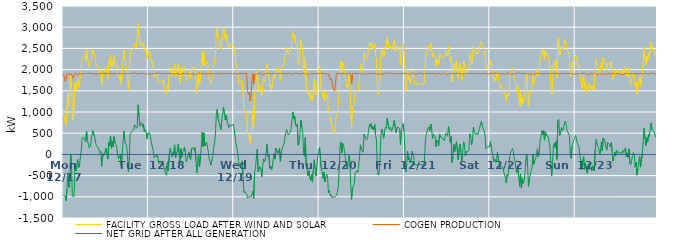
| Category | FACILITY GROSS LOAD AFTER WIND AND SOLAR | COGEN PRODUCTION | NET GRID AFTER ALL GENERATION |
|---|---|---|---|
|  Mon  12/17 | 934 | 1902 | -968 |
|  Mon  12/17 | 872 | 1835 | -963 |
|  Mon  12/17 | 745 | 1725 | -980 |
|  Mon  12/17 | 679 | 1770 | -1091 |
|  Mon  12/17 | 1091 | 1899 | -808 |
|  Mon  12/17 | 1448 | 1897 | -449 |
|  Mon  12/17 | 1136 | 1901 | -765 |
|  Mon  12/17 | 1113 | 1905 | -792 |
|  Mon  12/17 | 1889 | 1880 | 9 |
|  Mon  12/17 | 1763 | 1907 | -144 |
|  Mon  12/17 | 912 | 1899 | -987 |
|  Mon  12/17 | 807 | 1794 | -987 |
|  Mon  12/17 | 824 | 1813 | -989 |
|  Mon  12/17 | 1705 | 1916 | -211 |
|  Mon  12/17 | 1522 | 1912 | -390 |
|  Mon  12/17 | 1631 | 1900 | -269 |
|  Mon  12/17 | 1791 | 1911 | -120 |
|  Mon  12/17 | 1569 | 1884 | -315 |
|  Mon  12/17 | 1635 | 1921 | -286 |
|  Mon  12/17 | 1834 | 1894 | -60 |
|  Mon  12/17 | 1995 | 1912 | 83 |
|  Mon  12/17 | 2271 | 1893 | 378 |
|  Mon  12/17 | 2294 | 1908 | 386 |
|  Mon  12/17 | 2303 | 1904 | 399 |
|  Mon  12/17 | 2331 | 1909 | 422 |
|  Mon  12/17 | 2203 | 1908 | 295 |
|  Mon  12/17 | 2473 | 1922 | 551 |
|  Mon  12/17 | 2235 | 1902 | 333 |
|  Mon  12/17 | 2253 | 1907 | 346 |
|  Mon  12/17 | 2071 | 1919 | 152 |
|  Mon  12/17 | 2098 | 1916 | 182 |
|  Mon  12/17 | 2201 | 1906 | 295 |
|  Mon  12/17 | 2340 | 1904 | 436 |
|  Mon  12/17 | 2460 | 1899 | 561 |
|  Mon  12/17 | 2443 | 1898 | 545 |
|  Mon  12/17 | 2332 | 1902 | 430 |
|  Mon  12/17 | 2190 | 1900 | 290 |
|  Mon  12/17 | 2095 | 1885 | 210 |
|  Mon  12/17 | 2125 | 1907 | 218 |
|  Mon  12/17 | 2075 | 1914 | 161 |
|  Mon  12/17 | 2071 | 1911 | 160 |
|  Mon  12/17 | 1924 | 1887 | 37 |
|  Mon  12/17 | 1990 | 1920 | 70 |
|  Mon  12/17 | 1621 | 1902 | -281 |
|  Mon  12/17 | 1925 | 1892 | 33 |
|  Mon  12/17 | 1879 | 1920 | -41 |
|  Mon  12/17 | 1919 | 1913 | 6 |
|  Mon  12/17 | 1910 | 1905 | 5 |
|  Mon  12/17 | 2046 | 1898 | 148 |
|  Mon  12/17 | 1924 | 1922 | 2 |
|  Mon  12/17 | 1782 | 1893 | -111 |
|  Mon  12/17 | 2191 | 1915 | 276 |
|  Mon  12/17 | 2108 | 1912 | 196 |
|  Mon  12/17 | 2347 | 1915 | 432 |
|  Mon  12/17 | 2057 | 1912 | 145 |
|  Mon  12/17 | 2197 | 1886 | 311 |
|  Mon  12/17 | 2072 | 1892 | 180 |
|  Mon  12/17 | 2339 | 1922 | 417 |
|  Mon  12/17 | 2163 | 1888 | 275 |
|  Mon  12/17 | 2144 | 1904 | 240 |
|  Mon  12/17 | 2052 | 1905 | 147 |
|  Mon  12/17 | 1871 | 1885 | -14 |
|  Mon  12/17 | 1812 | 1914 | -102 |
|  Mon  12/17 | 1787 | 1904 | -117 |
|  Mon  12/17 | 1912 | 1902 | 10 |
|  Mon  12/17 | 1630 | 1910 | -280 |
|  Mon  12/17 | 1874 | 1891 | -17 |
|  Mon  12/17 | 2189 | 1911 | 278 |
|  Mon  12/17 | 2464 | 1916 | 548 |
|  Mon  12/17 | 2244 | 1895 | 349 |
|  Mon  12/17 | 2141 | 1897 | 244 |
|  Mon  12/17 | 2124 | 1906 | 218 |
|  Mon  12/17 | 1903 | 1908 | -5 |
|  Mon  12/17 | 1511 | 1914 | -403 |
|  Mon  12/17 | 1759 | 1904 | -145 |
|  Mon  12/17 | 2392 | 1904 | 488 |
|  Mon  12/17 | 2382 | 1911 | 471 |
|  Mon  12/17 | 2452 | 1908 | 544 |
|  Mon  12/17 | 2438 | 1917 | 521 |
|  Mon  12/17 | 2476 | 1897 | 579 |
|  Mon  12/17 | 2614 | 1915 | 699 |
|  Mon  12/17 | 2568 | 1894 | 674 |
|  Mon  12/17 | 2526 | 1911 | 615 |
|  Mon  12/17 | 2535 | 1883 | 652 |
|  Mon  12/17 | 3089 | 1921 | 1168 |
|  Mon  12/17 | 2785 | 1892 | 893 |
|  Mon  12/17 | 2555 | 1892 | 663 |
|  Mon  12/17 | 2587 | 1913 | 674 |
|  Mon  12/17 | 2657 | 1905 | 752 |
|  Mon  12/17 | 2564 | 1911 | 653 |
|  Mon  12/17 | 2626 | 1915 | 711 |
|  Mon  12/17 | 2428 | 1898 | 530 |
|  Mon  12/17 | 2486 | 1901 | 585 |
|  Mon  12/17 | 2444 | 1898 | 546 |
|  Mon  12/17 | 2251 | 1885 | 366 |
|  Mon  12/17 | 2397 | 1899 | 498 |
|  Tue  12/18 | 2416 | 1907 | 509 |
|  Tue  12/18 | 2411 | 1897 | 514 |
|  Tue  12/18 | 2299 | 1904 | 395 |
|  Tue  12/18 | 2166 | 1898 | 268 |
|  Tue  12/18 | 2200 | 1920 | 280 |
|  Tue  12/18 | 1981 | 1904 | 77 |
|  Tue  12/18 | 1826 | 1910 | -84 |
|  Tue  12/18 | 1803 | 1909 | -106 |
|  Tue  12/18 | 1900 | 1911 | -11 |
|  Tue  12/18 | 1852 | 1912 | -60 |
|  Tue  12/18 | 1874 | 1896 | -22 |
|  Tue  12/18 | 1713 | 1919 | -206 |
|  Tue  12/18 | 1720 | 1907 | -187 |
|  Tue  12/18 | 1700 | 1908 | -208 |
|  Tue  12/18 | 1689 | 1888 | -199 |
|  Tue  12/18 | 1698 | 1902 | -204 |
|  Tue  12/18 | 1760 | 1913 | -153 |
|  Tue  12/18 | 1614 | 1916 | -302 |
|  Tue  12/18 | 1517 | 1892 | -375 |
|  Tue  12/18 | 1440 | 1901 | -461 |
|  Tue  12/18 | 1416 | 1908 | -492 |
|  Tue  12/18 | 1634 | 1911 | -277 |
|  Tue  12/18 | 1527 | 1905 | -378 |
|  Tue  12/18 | 1899 | 1904 | -5 |
|  Tue  12/18 | 2052 | 1907 | 145 |
|  Tue  12/18 | 1948 | 1902 | 46 |
|  Tue  12/18 | 1843 | 1900 | -57 |
|  Tue  12/18 | 1948 | 1906 | 42 |
|  Tue  12/18 | 1880 | 1897 | -17 |
|  Tue  12/18 | 2126 | 1900 | 226 |
|  Tue  12/18 | 1810 | 1895 | -85 |
|  Tue  12/18 | 1899 | 1881 | 18 |
|  Tue  12/18 | 1987 | 1917 | 70 |
|  Tue  12/18 | 2138 | 1897 | 241 |
|  Tue  12/18 | 1929 | 1895 | 34 |
|  Tue  12/18 | 1688 | 1891 | -203 |
|  Tue  12/18 | 2027 | 1889 | 138 |
|  Tue  12/18 | 1833 | 1903 | -70 |
|  Tue  12/18 | 1967 | 1906 | 61 |
|  Tue  12/18 | 2007 | 1913 | 94 |
|  Tue  12/18 | 2074 | 1910 | 164 |
|  Tue  12/18 | 1967 | 1910 | 57 |
|  Tue  12/18 | 1726 | 1902 | -176 |
|  Tue  12/18 | 1763 | 1897 | -134 |
|  Tue  12/18 | 1749 | 1902 | -153 |
|  Tue  12/18 | 1947 | 1896 | 51 |
|  Tue  12/18 | 1845 | 1904 | -59 |
|  Tue  12/18 | 1786 | 1903 | -117 |
|  Tue  12/18 | 2018 | 1892 | 126 |
|  Tue  12/18 | 2064 | 1899 | 165 |
|  Tue  12/18 | 2056 | 1907 | 149 |
|  Tue  12/18 | 1985 | 1890 | 95 |
|  Tue  12/18 | 2054 | 1890 | 164 |
|  Tue  12/18 | 1775 | 1908 | -133 |
|  Tue  12/18 | 1457 | 1888 | -431 |
|  Tue  12/18 | 1719 | 1890 | -171 |
|  Tue  12/18 | 1926 | 1917 | 9 |
|  Tue  12/18 | 1605 | 1904 | -299 |
|  Tue  12/18 | 1813 | 1910 | -97 |
|  Tue  12/18 | 2091 | 1924 | 167 |
|  Tue  12/18 | 2431 | 1909 | 522 |
|  Tue  12/18 | 2098 | 1915 | 183 |
|  Tue  12/18 | 2397 | 1890 | 507 |
|  Tue  12/18 | 2092 | 1894 | 198 |
|  Tue  12/18 | 2155 | 1906 | 249 |
|  Tue  12/18 | 2178 | 1882 | 296 |
|  Tue  12/18 | 2194 | 1912 | 282 |
|  Tue  12/18 | 1935 | 1889 | 46 |
|  Tue  12/18 | 1781 | 1895 | -114 |
|  Tue  12/18 | 1713 | 1902 | -189 |
|  Tue  12/18 | 1659 | 1908 | -249 |
|  Tue  12/18 | 1781 | 1897 | -116 |
|  Tue  12/18 | 1859 | 1891 | -32 |
|  Tue  12/18 | 2079 | 1915 | 164 |
|  Tue  12/18 | 2183 | 1910 | 273 |
|  Tue  12/18 | 2401 | 1895 | 506 |
|  Tue  12/18 | 2898 | 1905 | 993 |
|  Tue  12/18 | 2980 | 1917 | 1063 |
|  Tue  12/18 | 2745 | 1905 | 840 |
|  Tue  12/18 | 2715 | 1893 | 822 |
|  Tue  12/18 | 2552 | 1897 | 655 |
|  Tue  12/18 | 2484 | 1902 | 582 |
|  Tue  12/18 | 2720 | 1917 | 803 |
|  Tue  12/18 | 2693 | 1903 | 790 |
|  Tue  12/18 | 3022 | 1913 | 1109 |
|  Tue  12/18 | 2858 | 1904 | 954 |
|  Tue  12/18 | 2717 | 1902 | 815 |
|  Tue  12/18 | 2847 | 1916 | 931 |
|  Tue  12/18 | 2691 | 1892 | 799 |
|  Tue  12/18 | 2599 | 1892 | 707 |
|  Tue  12/18 | 2541 | 1910 | 631 |
|  Tue  12/18 | 2617 | 1916 | 701 |
|  Tue  12/18 | 2578 | 1911 | 667 |
|  Tue  12/18 | 2566 | 1913 | 653 |
|  Tue  12/18 | 2580 | 1890 | 690 |
|  Tue  12/18 | 2627 | 1909 | 718 |
|  Wed  12/19 | 2497 | 1919 | 578 |
|  Wed  12/19 | 2344 | 1915 | 429 |
|  Wed  12/19 | 2164 | 1890 | 274 |
|  Wed  12/19 | 2142 | 1891 | 251 |
|  Wed  12/19 | 1955 | 1903 | 52 |
|  Wed  12/19 | 1728 | 1899 | -171 |
|  Wed  12/19 | 1635 | 1904 | -269 |
|  Wed  12/19 | 1616 | 1908 | -292 |
|  Wed  12/19 | 1695 | 1918 | -223 |
|  Wed  12/19 | 1751 | 1912 | -161 |
|  Wed  12/19 | 1415 | 1908 | -493 |
|  Wed  12/19 | 1002 | 1907 | -905 |
|  Wed  12/19 | 1024 | 1900 | -876 |
|  Wed  12/19 | 1017 | 1895 | -878 |
|  Wed  12/19 | 993 | 1921 | -928 |
|  Wed  12/19 | 475 | 1505 | -1030 |
|  Wed  12/19 | 413 | 1420 | -1007 |
|  Wed  12/19 | 475 | 1471 | -996 |
|  Wed  12/19 | 256 | 1267 | -1011 |
|  Wed  12/19 | 406 | 1408 | -1002 |
|  Wed  12/19 | 728 | 1723 | -995 |
|  Wed  12/19 | 1036 | 1908 | -872 |
|  Wed  12/19 | 622 | 1658 | -1036 |
|  Wed  12/19 | 1443 | 1879 | -436 |
|  Wed  12/19 | 1612 | 1896 | -284 |
|  Wed  12/19 | 1606 | 1900 | -294 |
|  Wed  12/19 | 2030 | 1906 | 124 |
|  Wed  12/19 | 1499 | 1905 | -406 |
|  Wed  12/19 | 1484 | 1905 | -421 |
|  Wed  12/19 | 1637 | 1927 | -290 |
|  Wed  12/19 | 1569 | 1902 | -333 |
|  Wed  12/19 | 1381 | 1909 | -528 |
|  Wed  12/19 | 1598 | 1884 | -286 |
|  Wed  12/19 | 1803 | 1906 | -103 |
|  Wed  12/19 | 1724 | 1892 | -168 |
|  Wed  12/19 | 1763 | 1899 | -136 |
|  Wed  12/19 | 1762 | 1907 | -145 |
|  Wed  12/19 | 2153 | 1914 | 239 |
|  Wed  12/19 | 1873 | 1918 | -45 |
|  Wed  12/19 | 1911 | 1904 | 7 |
|  Wed  12/19 | 1582 | 1910 | -328 |
|  Wed  12/19 | 1641 | 1918 | -277 |
|  Wed  12/19 | 1531 | 1897 | -366 |
|  Wed  12/19 | 1642 | 1906 | -264 |
|  Wed  12/19 | 1826 | 1915 | -89 |
|  Wed  12/19 | 1918 | 1900 | 18 |
|  Wed  12/19 | 1790 | 1901 | -111 |
|  Wed  12/19 | 2044 | 1895 | 149 |
|  Wed  12/19 | 1999 | 1906 | 93 |
|  Wed  12/19 | 1931 | 1910 | 21 |
|  Wed  12/19 | 1996 | 1914 | 82 |
|  Wed  12/19 | 2048 | 1906 | 142 |
|  Wed  12/19 | 1729 | 1904 | -175 |
|  Wed  12/19 | 1959 | 1912 | 47 |
|  Wed  12/19 | 2059 | 1915 | 144 |
|  Wed  12/19 | 2039 | 1905 | 134 |
|  Wed  12/19 | 2155 | 1909 | 246 |
|  Wed  12/19 | 2276 | 1900 | 376 |
|  Wed  12/19 | 2412 | 1899 | 513 |
|  Wed  12/19 | 2498 | 1912 | 586 |
|  Wed  12/19 | 2412 | 1899 | 513 |
|  Wed  12/19 | 2353 | 1897 | 456 |
|  Wed  12/19 | 2408 | 1919 | 489 |
|  Wed  12/19 | 2423 | 1897 | 526 |
|  Wed  12/19 | 2491 | 1891 | 600 |
|  Wed  12/19 | 2696 | 1911 | 785 |
|  Wed  12/19 | 2904 | 1902 | 1002 |
|  Wed  12/19 | 2757 | 1919 | 838 |
|  Wed  12/19 | 2816 | 1913 | 903 |
|  Wed  12/19 | 2595 | 1893 | 702 |
|  Wed  12/19 | 2576 | 1916 | 660 |
|  Wed  12/19 | 2621 | 1905 | 716 |
|  Wed  12/19 | 2122 | 1906 | 216 |
|  Wed  12/19 | 2157 | 1910 | 247 |
|  Wed  12/19 | 2388 | 1894 | 494 |
|  Wed  12/19 | 2718 | 1908 | 810 |
|  Wed  12/19 | 2546 | 1902 | 644 |
|  Wed  12/19 | 2467 | 1912 | 555 |
|  Wed  12/19 | 1952 | 1915 | 37 |
|  Wed  12/19 | 1872 | 1918 | -46 |
|  Wed  12/19 | 2299 | 1903 | 396 |
|  Wed  12/19 | 1659 | 1902 | -243 |
|  Wed  12/19 | 1531 | 1900 | -369 |
|  Wed  12/19 | 1407 | 1910 | -503 |
|  Wed  12/19 | 1504 | 1884 | -380 |
|  Wed  12/19 | 1349 | 1894 | -545 |
|  Wed  12/19 | 1292 | 1903 | -611 |
|  Wed  12/19 | 1438 | 1912 | -474 |
|  Wed  12/19 | 1247 | 1900 | -653 |
|  Wed  12/19 | 1539 | 1915 | -376 |
|  Wed  12/19 | 1774 | 1903 | -129 |
|  Wed  12/19 | 1552 | 1897 | -345 |
|  Wed  12/19 | 1401 | 1908 | -507 |
|  Wed  12/19 | 1578 | 1896 | -318 |
|  Wed  12/19 | 1877 | 1906 | -29 |
|  Wed  12/19 | 1996 | 1919 | 77 |
|  Thu  12/20 | 2086 | 1916 | 170 |
|  Thu  12/20 | 2083 | 1912 | 171 |
|  Thu  12/20 | 1555 | 1906 | -351 |
|  Thu  12/20 | 1491 | 1895 | -404 |
|  Thu  12/20 | 1352 | 1920 | -568 |
|  Thu  12/20 | 1496 | 1912 | -416 |
|  Thu  12/20 | 1258 | 1907 | -649 |
|  Thu  12/20 | 1384 | 1912 | -528 |
|  Thu  12/20 | 1426 | 1892 | -466 |
|  Thu  12/20 | 1396 | 1898 | -502 |
|  Thu  12/20 | 1001 | 1899 | -898 |
|  Thu  12/20 | 1039 | 1884 | -845 |
|  Thu  12/20 | 773 | 1754 | -981 |
|  Thu  12/20 | 839 | 1790 | -951 |
|  Thu  12/20 | 695 | 1723 | -1028 |
|  Thu  12/20 | 563 | 1562 | -999 |
|  Thu  12/20 | 554 | 1547 | -993 |
|  Thu  12/20 | 487 | 1495 | -1008 |
|  Thu  12/20 | 689 | 1677 | -988 |
|  Thu  12/20 | 945 | 1912 | -967 |
|  Thu  12/20 | 1004 | 1893 | -889 |
|  Thu  12/20 | 1143 | 1921 | -778 |
|  Thu  12/20 | 1488 | 1895 | -407 |
|  Thu  12/20 | 2084 | 1907 | 177 |
|  Thu  12/20 | 2197 | 1901 | 296 |
|  Thu  12/20 | 1943 | 1909 | 34 |
|  Thu  12/20 | 2168 | 1904 | 264 |
|  Thu  12/20 | 2118 | 1898 | 220 |
|  Thu  12/20 | 1984 | 1899 | 85 |
|  Thu  12/20 | 1823 | 1883 | -60 |
|  Thu  12/20 | 1676 | 1899 | -223 |
|  Thu  12/20 | 1571 | 1910 | -339 |
|  Thu  12/20 | 1649 | 1904 | -255 |
|  Thu  12/20 | 1883 | 1906 | -23 |
|  Thu  12/20 | 1821 | 1920 | -99 |
|  Thu  12/20 | 1215 | 1896 | -681 |
|  Thu  12/20 | 604 | 1667 | -1063 |
|  Thu  12/20 | 1104 | 1900 | -796 |
|  Thu  12/20 | 1102 | 1899 | -797 |
|  Thu  12/20 | 1203 | 1903 | -700 |
|  Thu  12/20 | 1450 | 1894 | -444 |
|  Thu  12/20 | 1442 | 1905 | -463 |
|  Thu  12/20 | 1514 | 1902 | -388 |
|  Thu  12/20 | 1488 | 1914 | -426 |
|  Thu  12/20 | 1630 | 1900 | -270 |
|  Thu  12/20 | 1845 | 1903 | -58 |
|  Thu  12/20 | 2133 | 1908 | 225 |
|  Thu  12/20 | 2016 | 1897 | 119 |
|  Thu  12/20 | 2042 | 1904 | 138 |
|  Thu  12/20 | 1958 | 1906 | 52 |
|  Thu  12/20 | 2381 | 1899 | 482 |
|  Thu  12/20 | 2404 | 1906 | 498 |
|  Thu  12/20 | 2289 | 1923 | 366 |
|  Thu  12/20 | 2221 | 1882 | 339 |
|  Thu  12/20 | 2292 | 1896 | 396 |
|  Thu  12/20 | 2451 | 1916 | 535 |
|  Thu  12/20 | 2626 | 1924 | 702 |
|  Thu  12/20 | 2568 | 1911 | 657 |
|  Thu  12/20 | 2645 | 1915 | 730 |
|  Thu  12/20 | 2505 | 1908 | 597 |
|  Thu  12/20 | 2570 | 1917 | 653 |
|  Thu  12/20 | 2484 | 1904 | 580 |
|  Thu  12/20 | 2623 | 1913 | 710 |
|  Thu  12/20 | 2360 | 1908 | 452 |
|  Thu  12/20 | 2246 | 1906 | 340 |
|  Thu  12/20 | 1592 | 1895 | -303 |
|  Thu  12/20 | 1411 | 1896 | -485 |
|  Thu  12/20 | 1471 | 1903 | -432 |
|  Thu  12/20 | 1772 | 1897 | -125 |
|  Thu  12/20 | 2334 | 1889 | 445 |
|  Thu  12/20 | 2485 | 1892 | 593 |
|  Thu  12/20 | 2417 | 1898 | 519 |
|  Thu  12/20 | 2285 | 1907 | 378 |
|  Thu  12/20 | 2416 | 1892 | 524 |
|  Thu  12/20 | 2557 | 1919 | 638 |
|  Thu  12/20 | 2520 | 1909 | 611 |
|  Thu  12/20 | 2773 | 1916 | 857 |
|  Thu  12/20 | 2766 | 1915 | 851 |
|  Thu  12/20 | 2531 | 1910 | 621 |
|  Thu  12/20 | 2490 | 1910 | 580 |
|  Thu  12/20 | 2557 | 1920 | 637 |
|  Thu  12/20 | 2446 | 1900 | 546 |
|  Thu  12/20 | 2504 | 1905 | 599 |
|  Thu  12/20 | 2507 | 1897 | 610 |
|  Thu  12/20 | 2693 | 1892 | 801 |
|  Thu  12/20 | 2687 | 1903 | 784 |
|  Thu  12/20 | 2427 | 1909 | 518 |
|  Thu  12/20 | 2516 | 1918 | 598 |
|  Thu  12/20 | 2553 | 1907 | 646 |
|  Thu  12/20 | 2537 | 1890 | 647 |
|  Thu  12/20 | 2503 | 1891 | 612 |
|  Thu  12/20 | 2120 | 1890 | 230 |
|  Thu  12/20 | 2491 | 1913 | 578 |
|  Thu  12/20 | 2509 | 1914 | 595 |
|  Thu  12/20 | 2632 | 1907 | 725 |
|  Thu  12/20 | 2441 | 1897 | 544 |
|  Fri  12/21 | 2455 | 1913 | 542 |
|  Fri  12/21 | 1485 | 1903 | -418 |
|  Fri  12/21 | 1671 | 1904 | -233 |
|  Fri  12/21 | 2002 | 1919 | 83 |
|  Fri  12/21 | 1766 | 1896 | -130 |
|  Fri  12/21 | 1831 | 1902 | -71 |
|  Fri  12/21 | 1686 | 1883 | -197 |
|  Fri  12/21 | 1761 | 1910 | -149 |
|  Fri  12/21 | 1979 | 1904 | 75 |
|  Fri  12/21 | 1939 | 1916 | 23 |
|  Fri  12/21 | 1854 | 1916 | -62 |
|  Fri  12/21 | 1650 | 1894 | -244 |
|  Fri  12/21 | 1678 | 1907 | -229 |
|  Fri  12/21 | 1652 | 1892 | -240 |
|  Fri  12/21 | 1627 | 1900 | -273 |
|  Fri  12/21 | 1697 | 1914 | -217 |
|  Fri  12/21 | 1692 | 1903 | -211 |
|  Fri  12/21 | 1661 | 1908 | -247 |
|  Fri  12/21 | 1681 | 1898 | -217 |
|  Fri  12/21 | 1683 | 1917 | -234 |
|  Fri  12/21 | 1613 | 1890 | -277 |
|  Fri  12/21 | 1650 | 1908 | -258 |
|  Fri  12/21 | 1730 | 1906 | -176 |
|  Fri  12/21 | 2218 | 1902 | 316 |
|  Fri  12/21 | 2369 | 1908 | 461 |
|  Fri  12/21 | 2386 | 1911 | 475 |
|  Fri  12/21 | 2518 | 1901 | 617 |
|  Fri  12/21 | 2555 | 1906 | 649 |
|  Fri  12/21 | 2457 | 1910 | 547 |
|  Fri  12/21 | 2625 | 1910 | 715 |
|  Fri  12/21 | 2535 | 1918 | 617 |
|  Fri  12/21 | 2287 | 1913 | 374 |
|  Fri  12/21 | 2381 | 1906 | 475 |
|  Fri  12/21 | 2378 | 1888 | 490 |
|  Fri  12/21 | 2317 | 1895 | 422 |
|  Fri  12/21 | 2076 | 1892 | 184 |
|  Fri  12/21 | 2231 | 1892 | 339 |
|  Fri  12/21 | 2227 | 1916 | 311 |
|  Fri  12/21 | 2111 | 1907 | 204 |
|  Fri  12/21 | 2384 | 1902 | 482 |
|  Fri  12/21 | 2315 | 1907 | 408 |
|  Fri  12/21 | 2307 | 1897 | 410 |
|  Fri  12/21 | 2305 | 1906 | 399 |
|  Fri  12/21 | 2260 | 1902 | 358 |
|  Fri  12/21 | 2237 | 1915 | 322 |
|  Fri  12/21 | 2316 | 1917 | 399 |
|  Fri  12/21 | 2423 | 1921 | 502 |
|  Fri  12/21 | 2366 | 1878 | 488 |
|  Fri  12/21 | 2326 | 1900 | 426 |
|  Fri  12/21 | 2557 | 1898 | 659 |
|  Fri  12/21 | 2415 | 1894 | 521 |
|  Fri  12/21 | 2189 | 1903 | 286 |
|  Fri  12/21 | 2306 | 1883 | 423 |
|  Fri  12/21 | 1712 | 1904 | -192 |
|  Fri  12/21 | 1845 | 1904 | -59 |
|  Fri  12/21 | 2147 | 1910 | 237 |
|  Fri  12/21 | 1961 | 1896 | 65 |
|  Fri  12/21 | 2101 | 1895 | 206 |
|  Fri  12/21 | 2219 | 1916 | 303 |
|  Fri  12/21 | 2225 | 1922 | 303 |
|  Fri  12/21 | 1795 | 1922 | -127 |
|  Fri  12/21 | 2042 | 1898 | 144 |
|  Fri  12/21 | 2153 | 1910 | 243 |
|  Fri  12/21 | 1954 | 1908 | 46 |
|  Fri  12/21 | 1735 | 1892 | -157 |
|  Fri  12/21 | 1972 | 1881 | 91 |
|  Fri  12/21 | 2204 | 1910 | 294 |
|  Fri  12/21 | 2109 | 1893 | 216 |
|  Fri  12/21 | 1870 | 1906 | -36 |
|  Fri  12/21 | 1979 | 1904 | 75 |
|  Fri  12/21 | 1943 | 1896 | 47 |
|  Fri  12/21 | 1954 | 1880 | 74 |
|  Fri  12/21 | 2026 | 1911 | 115 |
|  Fri  12/21 | 2384 | 1899 | 485 |
|  Fri  12/21 | 2347 | 1907 | 440 |
|  Fri  12/21 | 2128 | 1904 | 224 |
|  Fri  12/21 | 2272 | 1911 | 361 |
|  Fri  12/21 | 2545 | 1905 | 640 |
|  Fri  12/21 | 2441 | 1906 | 535 |
|  Fri  12/21 | 2436 | 1899 | 537 |
|  Fri  12/21 | 2364 | 1901 | 463 |
|  Fri  12/21 | 2402 | 1901 | 501 |
|  Fri  12/21 | 2371 | 1906 | 465 |
|  Fri  12/21 | 2363 | 1907 | 456 |
|  Fri  12/21 | 2531 | 1911 | 620 |
|  Fri  12/21 | 2611 | 1902 | 709 |
|  Fri  12/21 | 2669 | 1892 | 777 |
|  Fri  12/21 | 2587 | 1908 | 679 |
|  Fri  12/21 | 2520 | 1906 | 614 |
|  Fri  12/21 | 2455 | 1901 | 554 |
|  Fri  12/21 | 2374 | 1914 | 460 |
|  Fri  12/21 | 2039 | 1908 | 131 |
|  Fri  12/21 | 2014 | 1896 | 118 |
|  Fri  12/21 | 2102 | 1910 | 192 |
|  Fri  12/21 | 2084 | 1890 | 194 |
|  Fri  12/21 | 2067 | 1894 | 173 |
|  Sat  12/22 | 2228 | 1922 | 306 |
|  Sat  12/22 | 2103 | 1901 | 202 |
|  Sat  12/22 | 1955 | 1906 | 49 |
|  Sat  12/22 | 1884 | 1899 | -15 |
|  Sat  12/22 | 1741 | 1911 | -170 |
|  Sat  12/22 | 1805 | 1909 | -104 |
|  Sat  12/22 | 1733 | 1925 | -192 |
|  Sat  12/22 | 1747 | 1910 | -163 |
|  Sat  12/22 | 1957 | 1911 | 46 |
|  Sat  12/22 | 1818 | 1909 | -91 |
|  Sat  12/22 | 1795 | 1896 | -101 |
|  Sat  12/22 | 1570 | 1909 | -339 |
|  Sat  12/22 | 1631 | 1906 | -275 |
|  Sat  12/22 | 1629 | 1899 | -270 |
|  Sat  12/22 | 1598 | 1899 | -301 |
|  Sat  12/22 | 1580 | 1896 | -316 |
|  Sat  12/22 | 1416 | 1898 | -482 |
|  Sat  12/22 | 1357 | 1903 | -546 |
|  Sat  12/22 | 1234 | 1897 | -663 |
|  Sat  12/22 | 1428 | 1905 | -477 |
|  Sat  12/22 | 1414 | 1920 | -506 |
|  Sat  12/22 | 1386 | 1906 | -520 |
|  Sat  12/22 | 1873 | 1897 | -24 |
|  Sat  12/22 | 1963 | 1906 | 57 |
|  Sat  12/22 | 1988 | 1894 | 94 |
|  Sat  12/22 | 2059 | 1917 | 142 |
|  Sat  12/22 | 1970 | 1912 | 58 |
|  Sat  12/22 | 1797 | 1887 | -90 |
|  Sat  12/22 | 1744 | 1913 | -169 |
|  Sat  12/22 | 1537 | 1911 | -374 |
|  Sat  12/22 | 1481 | 1917 | -436 |
|  Sat  12/22 | 1642 | 1906 | -264 |
|  Sat  12/22 | 1374 | 1914 | -540 |
|  Sat  12/22 | 1152 | 1909 | -757 |
|  Sat  12/22 | 1451 | 1911 | -460 |
|  Sat  12/22 | 1116 | 1911 | -795 |
|  Sat  12/22 | 1350 | 1909 | -559 |
|  Sat  12/22 | 1209 | 1892 | -683 |
|  Sat  12/22 | 1292 | 1910 | -618 |
|  Sat  12/22 | 1445 | 1908 | -463 |
|  Sat  12/22 | 1778 | 1906 | -128 |
|  Sat  12/22 | 1908 | 1903 | 5 |
|  Sat  12/22 | 1607 | 1893 | -286 |
|  Sat  12/22 | 1147 | 1900 | -753 |
|  Sat  12/22 | 1331 | 1904 | -573 |
|  Sat  12/22 | 1425 | 1910 | -485 |
|  Sat  12/22 | 1513 | 1890 | -377 |
|  Sat  12/22 | 1585 | 1897 | -312 |
|  Sat  12/22 | 1912 | 1904 | 8 |
|  Sat  12/22 | 1677 | 1909 | -232 |
|  Sat  12/22 | 1731 | 1875 | -144 |
|  Sat  12/22 | 1803 | 1908 | -105 |
|  Sat  12/22 | 1902 | 1907 | -5 |
|  Sat  12/22 | 2045 | 1910 | 135 |
|  Sat  12/22 | 1849 | 1898 | -49 |
|  Sat  12/22 | 1949 | 1913 | 36 |
|  Sat  12/22 | 2233 | 1925 | 308 |
|  Sat  12/22 | 2335 | 1905 | 430 |
|  Sat  12/22 | 2467 | 1906 | 561 |
|  Sat  12/22 | 2370 | 1898 | 472 |
|  Sat  12/22 | 2479 | 1917 | 562 |
|  Sat  12/22 | 2241 | 1906 | 335 |
|  Sat  12/22 | 2432 | 1896 | 536 |
|  Sat  12/22 | 2358 | 1909 | 449 |
|  Sat  12/22 | 2340 | 1909 | 431 |
|  Sat  12/22 | 2328 | 1897 | 431 |
|  Sat  12/22 | 2334 | 1916 | 418 |
|  Sat  12/22 | 2091 | 1901 | 190 |
|  Sat  12/22 | 1722 | 1914 | -192 |
|  Sat  12/22 | 1398 | 1910 | -512 |
|  Sat  12/22 | 1672 | 1908 | -236 |
|  Sat  12/22 | 2108 | 1907 | 201 |
|  Sat  12/22 | 2170 | 1901 | 269 |
|  Sat  12/22 | 2070 | 1904 | 166 |
|  Sat  12/22 | 2225 | 1908 | 317 |
|  Sat  12/22 | 1807 | 1923 | -116 |
|  Sat  12/22 | 2688 | 1895 | 793 |
|  Sat  12/22 | 2731 | 1904 | 827 |
|  Sat  12/22 | 2339 | 1894 | 445 |
|  Sat  12/22 | 2420 | 1911 | 509 |
|  Sat  12/22 | 2544 | 1913 | 631 |
|  Sat  12/22 | 2460 | 1905 | 555 |
|  Sat  12/22 | 2493 | 1906 | 587 |
|  Sat  12/22 | 2471 | 1907 | 564 |
|  Sat  12/22 | 2701 | 1916 | 785 |
|  Sat  12/22 | 2669 | 1912 | 757 |
|  Sat  12/22 | 2498 | 1902 | 596 |
|  Sat  12/22 | 2441 | 1910 | 531 |
|  Sat  12/22 | 2434 | 1908 | 526 |
|  Sat  12/22 | 2341 | 1899 | 442 |
|  Sat  12/22 | 1894 | 1911 | -17 |
|  Sat  12/22 | 1833 | 1926 | -93 |
|  Sat  12/22 | 2095 | 1896 | 199 |
|  Sat  12/22 | 2190 | 1910 | 280 |
|  Sat  12/22 | 2227 | 1890 | 337 |
|  Sat  12/22 | 2246 | 1889 | 357 |
|  Sun  12/23 | 2349 | 1896 | 453 |
|  Sun  12/23 | 2342 | 1912 | 430 |
|  Sun  12/23 | 2159 | 1897 | 262 |
|  Sun  12/23 | 2169 | 1907 | 262 |
|  Sun  12/23 | 2054 | 1906 | 148 |
|  Sun  12/23 | 1841 | 1896 | -55 |
|  Sun  12/23 | 1713 | 1910 | -197 |
|  Sun  12/23 | 1543 | 1911 | -368 |
|  Sun  12/23 | 1788 | 1912 | -124 |
|  Sun  12/23 | 1856 | 1910 | -54 |
|  Sun  12/23 | 1551 | 1912 | -361 |
|  Sun  12/23 | 1689 | 1897 | -208 |
|  Sun  12/23 | 1694 | 1886 | -192 |
|  Sun  12/23 | 1449 | 1891 | -442 |
|  Sun  12/23 | 1573 | 1895 | -322 |
|  Sun  12/23 | 1685 | 1901 | -216 |
|  Sun  12/23 | 1567 | 1889 | -322 |
|  Sun  12/23 | 1623 | 1914 | -291 |
|  Sun  12/23 | 1517 | 1908 | -391 |
|  Sun  12/23 | 1631 | 1898 | -267 |
|  Sun  12/23 | 1635 | 1887 | -252 |
|  Sun  12/23 | 1532 | 1918 | -386 |
|  Sun  12/23 | 2015 | 1903 | 112 |
|  Sun  12/23 | 2246 | 1895 | 351 |
|  Sun  12/23 | 2164 | 1916 | 248 |
|  Sun  12/23 | 2129 | 1876 | 253 |
|  Sun  12/23 | 2028 | 1898 | 130 |
|  Sun  12/23 | 1908 | 1907 | 1 |
|  Sun  12/23 | 2006 | 1905 | 101 |
|  Sun  12/23 | 2187 | 1896 | 291 |
|  Sun  12/23 | 1989 | 1910 | 79 |
|  Sun  12/23 | 2290 | 1901 | 389 |
|  Sun  12/23 | 2258 | 1900 | 358 |
|  Sun  12/23 | 2198 | 1888 | 310 |
|  Sun  12/23 | 2075 | 1900 | 175 |
|  Sun  12/23 | 1997 | 1889 | 108 |
|  Sun  12/23 | 2174 | 1896 | 278 |
|  Sun  12/23 | 2181 | 1920 | 261 |
|  Sun  12/23 | 2131 | 1899 | 232 |
|  Sun  12/23 | 2079 | 1900 | 179 |
|  Sun  12/23 | 2197 | 1916 | 281 |
|  Sun  12/23 | 1968 | 1897 | 71 |
|  Sun  12/23 | 1757 | 1918 | -161 |
|  Sun  12/23 | 1834 | 1913 | -79 |
|  Sun  12/23 | 1938 | 1890 | 48 |
|  Sun  12/23 | 1858 | 1892 | -34 |
|  Sun  12/23 | 2017 | 1916 | 101 |
|  Sun  12/23 | 1978 | 1905 | 73 |
|  Sun  12/23 | 1916 | 1897 | 19 |
|  Sun  12/23 | 1971 | 1913 | 58 |
|  Sun  12/23 | 1943 | 1908 | 35 |
|  Sun  12/23 | 1933 | 1897 | 36 |
|  Sun  12/23 | 1899 | 1890 | 9 |
|  Sun  12/23 | 1998 | 1900 | 98 |
|  Sun  12/23 | 1925 | 1877 | 48 |
|  Sun  12/23 | 2001 | 1911 | 90 |
|  Sun  12/23 | 2079 | 1922 | 157 |
|  Sun  12/23 | 1856 | 1912 | -56 |
|  Sun  12/23 | 1936 | 1905 | 31 |
|  Sun  12/23 | 1832 | 1902 | -70 |
|  Sun  12/23 | 2044 | 1914 | 130 |
|  Sun  12/23 | 1682 | 1903 | -221 |
|  Sun  12/23 | 1644 | 1892 | -248 |
|  Sun  12/23 | 1778 | 1911 | -133 |
|  Sun  12/23 | 1880 | 1915 | -35 |
|  Sun  12/23 | 1942 | 1898 | 44 |
|  Sun  12/23 | 1898 | 1895 | 3 |
|  Sun  12/23 | 1608 | 1909 | -301 |
|  Sun  12/23 | 1719 | 1901 | -182 |
|  Sun  12/23 | 1418 | 1907 | -489 |
|  Sun  12/23 | 1548 | 1896 | -348 |
|  Sun  12/23 | 1728 | 1894 | -166 |
|  Sun  12/23 | 1855 | 1904 | -49 |
|  Sun  12/23 | 1609 | 1909 | -300 |
|  Sun  12/23 | 1611 | 1920 | -309 |
|  Sun  12/23 | 1910 | 1891 | 19 |
|  Sun  12/23 | 2221 | 1904 | 317 |
|  Sun  12/23 | 2517 | 1903 | 614 |
|  Sun  12/23 | 2262 | 1898 | 364 |
|  Sun  12/23 | 2114 | 1914 | 200 |
|  Sun  12/23 | 2308 | 1916 | 392 |
|  Sun  12/23 | 2189 | 1899 | 290 |
|  Sun  12/23 | 2374 | 1908 | 466 |
|  Sun  12/23 | 2308 | 1887 | 421 |
|  Sun  12/23 | 2563 | 1923 | 640 |
|  Sun  12/23 | 2656 | 1915 | 741 |
|  Sun  12/23 | 2484 | 1903 | 581 |
|  Sun  12/23 | 2458 | 1892 | 566 |
|  Sun  12/23 | 2458 | 1916 | 542 |
|  Sun  12/23 | 2451 | 1915 | 536 |
|  Sun  12/23 | 2303 | 1896 | 407 |
|  Sun  12/23 | 2324 | 1907 | 417 |